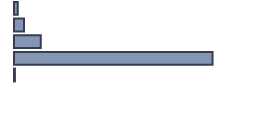
| Category | Percentatge |
|---|---|
| 0 | 1.591 |
| 1 | 4.167 |
| 2 | 11.136 |
| 3 | 82.727 |
| 4 | 0.379 |
| 5 | 0 |